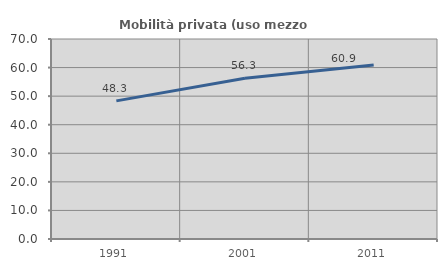
| Category | Mobilità privata (uso mezzo privato) |
|---|---|
| 1991.0 | 48.344 |
| 2001.0 | 56.296 |
| 2011.0 | 60.882 |